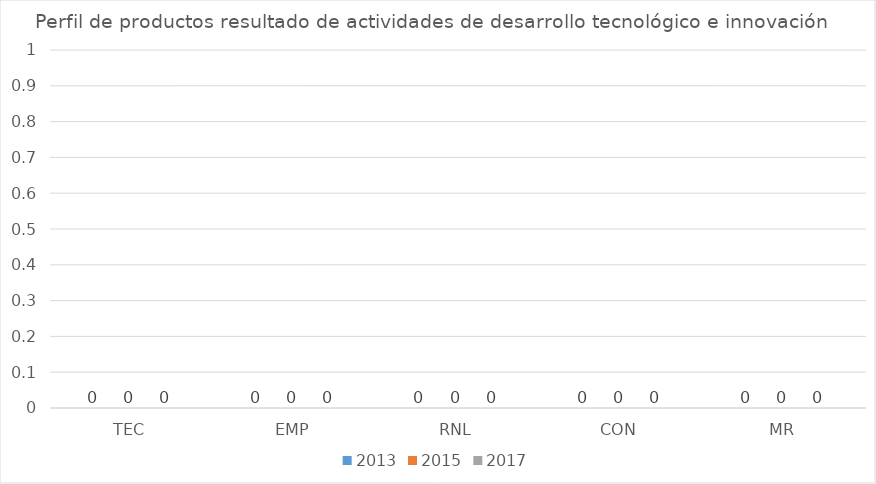
| Category | 2013 | 2015 | 2017 |
|---|---|---|---|
| TEC | 0 | 0 | 0 |
| EMP | 0 | 0 | 0 |
| RNL | 0 | 0 | 0 |
| CON | 0 | 0 | 0 |
| MR | 0 | 0 | 0 |